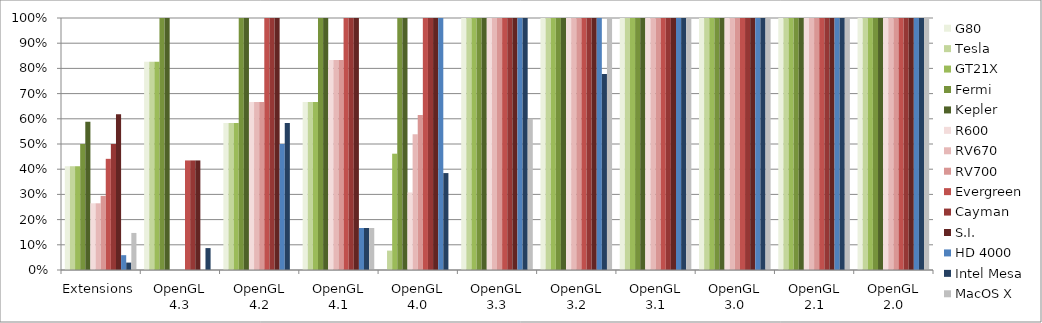
| Category | G80 | Tesla | GT21X | Fermi | Kepler | R600 | RV670 | RV700 | Evergreen | Cayman | S.I. | HD 4000 | Intel Mesa | MacOS X |
|---|---|---|---|---|---|---|---|---|---|---|---|---|---|---|
| Extensions | 0.412 | 0.412 | 0.412 | 0.5 | 0.588 | 0.265 | 0.265 | 0.294 | 0.441 | 0.5 | 0.618 | 0.059 | 0.029 | 0.147 |
| OpenGL 4.3 | 0.826 | 0.826 | 0.826 | 1 | 1 | 0 | 0 | 0 | 0.435 | 0.435 | 0.435 | 0 | 0.087 | 0 |
| OpenGL 4.2 | 0.583 | 0.583 | 0.583 | 1 | 1 | 0.667 | 0.667 | 0.667 | 1 | 1 | 1 | 0.5 | 0.583 | 0 |
| OpenGL 4.1 | 0.667 | 0.667 | 0.667 | 1 | 1 | 0.833 | 0.833 | 0.833 | 1 | 1 | 1 | 0.167 | 0.167 | 0.167 |
| OpenGL 4.0 | 0 | 0.077 | 0.462 | 1 | 1 | 0.308 | 0.538 | 0.615 | 1 | 1 | 1 | 1 | 0.385 | 0 |
| OpenGL 3.3 | 1 | 1 | 1 | 1 | 1 | 1 | 1 | 1 | 1 | 1 | 1 | 1 | 1 | 0.6 |
| OpenGL 3.2 | 1 | 1 | 1 | 1 | 1 | 1 | 1 | 1 | 1 | 1 | 1 | 1 | 0.778 | 1 |
| OpenGL 3.1 | 1 | 1 | 1 | 1 | 1 | 1 | 1 | 1 | 1 | 1 | 1 | 1 | 1 | 1 |
| OpenGL 3.0 | 1 | 1 | 1 | 1 | 1 | 1 | 1 | 1 | 1 | 1 | 1 | 1 | 1 | 1 |
| OpenGL 2.1 | 1 | 1 | 1 | 1 | 1 | 1 | 1 | 1 | 1 | 1 | 1 | 1 | 1 | 1 |
| OpenGL 2.0 | 1 | 1 | 1 | 1 | 1 | 1 | 1 | 1 | 1 | 1 | 1 | 1 | 1 | 1 |